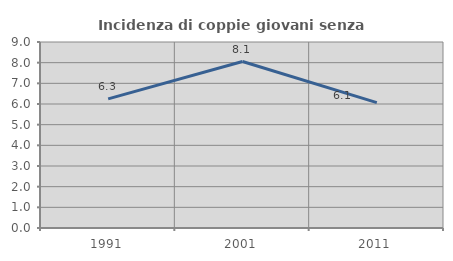
| Category | Incidenza di coppie giovani senza figli |
|---|---|
| 1991.0 | 6.25 |
| 2001.0 | 8.055 |
| 2011.0 | 6.068 |